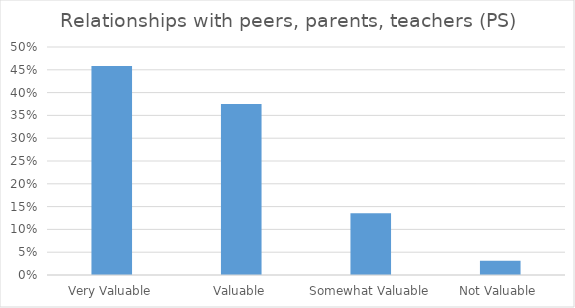
| Category | Relationships with peers, parents, teachers (PS) |
|---|---|
| Very Valuable | 0.458 |
| Valuable | 0.375 |
| Somewhat Valuable | 0.135 |
| Not Valuable | 0.031 |